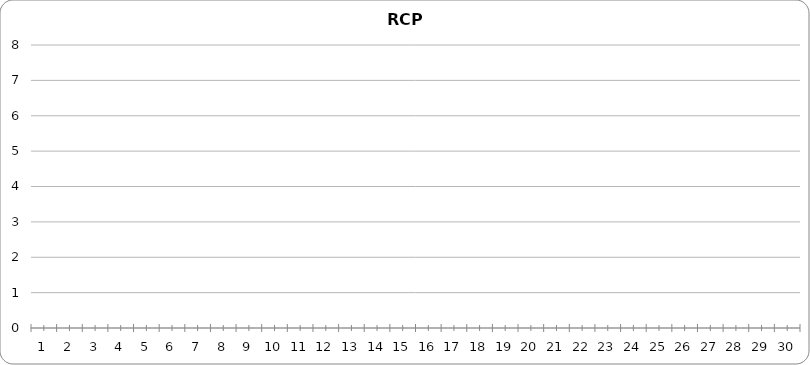
| Category | No. of H | No. of C |
|---|---|---|
| 0 | 0 | 0 |
| 1 | 0 | 0 |
| 2 | 0 | 0 |
| 3 | 0 | 0 |
| 4 | 0 | 0 |
| 5 | 0 | 0 |
| 6 | 0 | 0 |
| 7 | 0 | 0 |
| 8 | 0 | 0 |
| 9 | 0 | 0 |
| 10 | 0 | 0 |
| 11 | 0 | 0 |
| 12 | 0 | 0 |
| 13 | 0 | 0 |
| 14 | 0 | 0 |
| 15 | 0 | 0 |
| 16 | 0 | 0 |
| 17 | 0 | 0 |
| 18 | 0 | 0 |
| 19 | 0 | 0 |
| 20 | 0 | 0 |
| 21 | 0 | 0 |
| 22 | 0 | 0 |
| 23 | 0 | 0 |
| 24 | 0 | 0 |
| 25 | 0 | 0 |
| 26 | 0 | 0 |
| 27 | 0 | 0 |
| 28 | 0 | 0 |
| 29 | 0 | 0 |